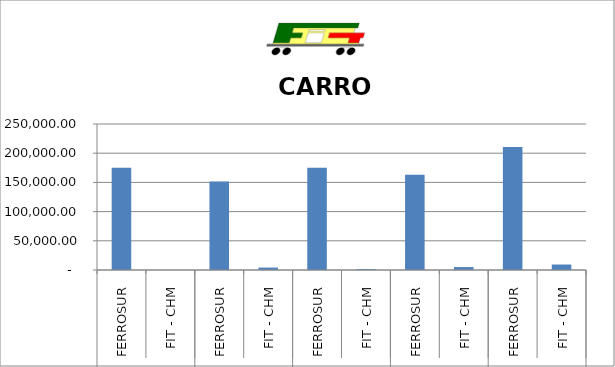
| Category | CARRO KM |
|---|---|
| 0 | 175151.5 |
| 1 | 0 |
| 2 | 151752.5 |
| 3 | 4136 |
| 4 | 174902 |
| 5 | 1548 |
| 6 | 163202.5 |
| 7 | 5039 |
| 8 | 210808 |
| 9 | 9355.5 |